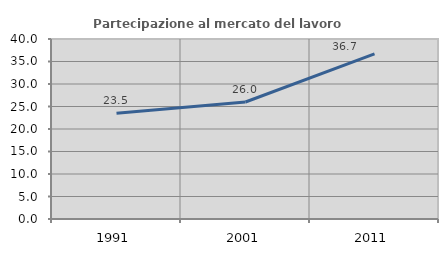
| Category | Partecipazione al mercato del lavoro  femminile |
|---|---|
| 1991.0 | 23.511 |
| 2001.0 | 26.003 |
| 2011.0 | 36.677 |